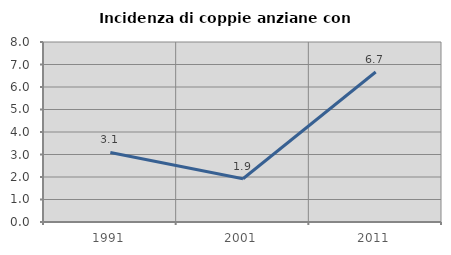
| Category | Incidenza di coppie anziane con figli |
|---|---|
| 1991.0 | 3.093 |
| 2001.0 | 1.923 |
| 2011.0 | 6.667 |